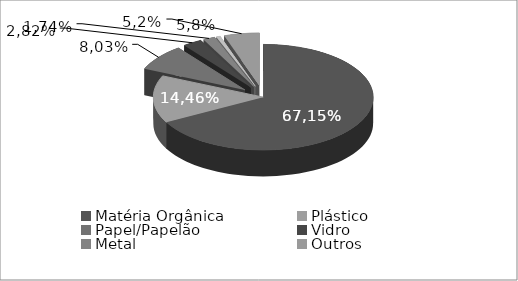
| Category | Series 0 |
|---|---|
| Matéria Orgânica | 67.15 |
| Plástico | 14.46 |
| Papel/Papelão | 8.03 |
| Vidro | 2.82 |
| Metal | 1.74 |
| Alumínio | 0.6 |
| Outros | 5.2 |